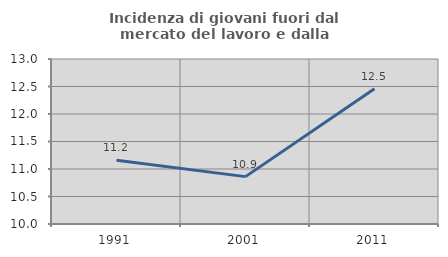
| Category | Incidenza di giovani fuori dal mercato del lavoro e dalla formazione  |
|---|---|
| 1991.0 | 11.16 |
| 2001.0 | 10.861 |
| 2011.0 | 12.459 |